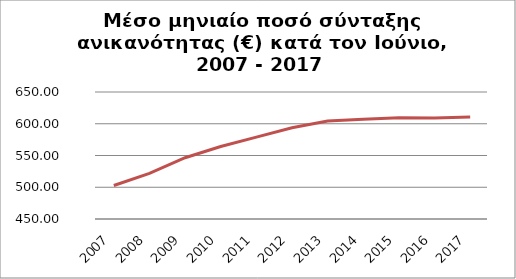
| Category | Series 1 |
|---|---|
| 2007.0 | 502.814 |
| 2008.0 | 521.879 |
| 2009.0 | 546.531 |
| 2010.0 | 564.26 |
| 2011.0 | 578.914 |
| 2012.0 | 593.581 |
| 2013.0 | 604.194 |
| 2014.0 | 607.259 |
| 2015.0 | 609.599 |
| 2016.0 | 609.16 |
| 2017.0 | 610.67 |